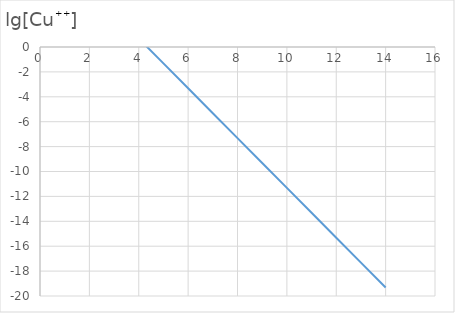
| Category | lg[Cu++]  |
|---|---|
| 4.0 | 0.681 |
| 5.0 | -1.319 |
| 6.0 | -3.319 |
| 7.0 | -5.319 |
| 8.0 | -7.319 |
| 9.0 | -9.319 |
| 10.0 | -11.319 |
| 11.0 | -13.319 |
| 12.0 | -15.319 |
| 13.0 | -17.319 |
| 14.0 | -19.319 |